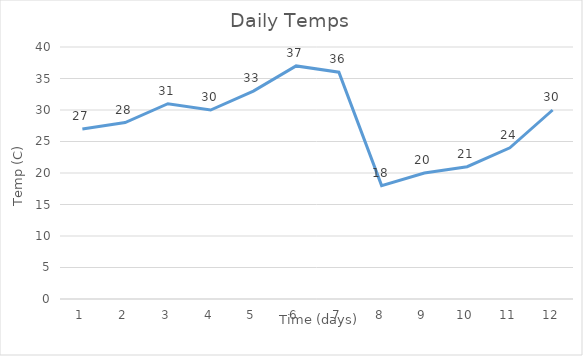
| Category | Temperature © |
|---|---|
| 1.0 | 27 |
| 2.0 | 28 |
| 3.0 | 31 |
| 4.0 | 30 |
| 5.0 | 33 |
| 6.0 | 37 |
| 7.0 | 36 |
| 8.0 | 18 |
| 9.0 | 20 |
| 10.0 | 21 |
| 11.0 | 24 |
| 12.0 | 30 |